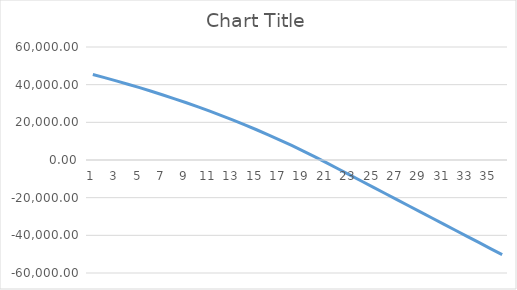
| Category | Series 0 |
|---|---|
| 0 | 45408.749 |
| 1 | 43748.163 |
| 2 | 42029.487 |
| 3 | 40250.691 |
| 4 | 38409.67 |
| 5 | 36504.249 |
| 6 | 34532.174 |
| 7 | 32491.114 |
| 8 | 30378.655 |
| 9 | 28192.301 |
| 10 | 25929.466 |
| 11 | 23587.475 |
| 12 | 21163.558 |
| 13 | 18654.85 |
| 14 | 16058.386 |
| 15 | 13371.094 |
| 16 | 10589.798 |
| 17 | 7711.21 |
| 18 | 4731.926 |
| 19 | 1648.424 |
| 20 | -1542.943 |
| 21 | -4791.973 |
| 22 | -8041.003 |
| 23 | -11290.033 |
| 24 | -14539.063 |
| 25 | -17788.093 |
| 26 | -21037.123 |
| 27 | -24286.153 |
| 28 | -27535.183 |
| 29 | -30784.213 |
| 30 | -34033.243 |
| 31 | -37282.273 |
| 32 | -40531.303 |
| 33 | -43780.333 |
| 34 | -47029.363 |
| 35 | -50278.393 |